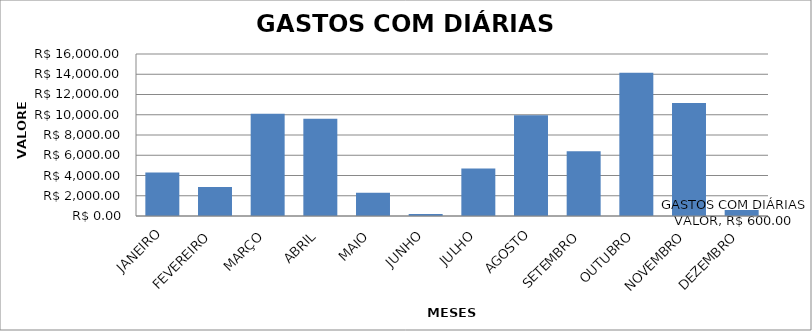
| Category | GASTOS COM DIÁRIAS VALOR |
|---|---|
| JANEIRO | 4285 |
| FEVEREIRO | 2875 |
| MARÇO | 10100 |
| ABRIL | 9600 |
| MAIO | 2300 |
| JUNHO | 200 |
| JULHO | 4700 |
| AGOSTO | 9950 |
| SETEMBRO | 6400 |
| OUTUBRO | 14150 |
| NOVEMBRO | 11150 |
| DEZEMBRO | 600 |